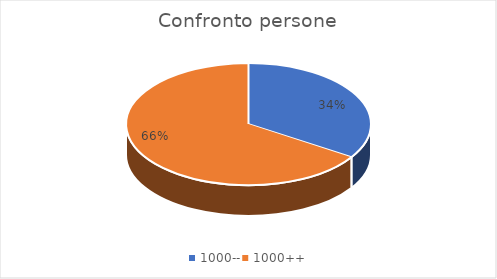
| Category | Series 0 |
|---|---|
| 1000-- | 295 |
| 1000++ | 569 |